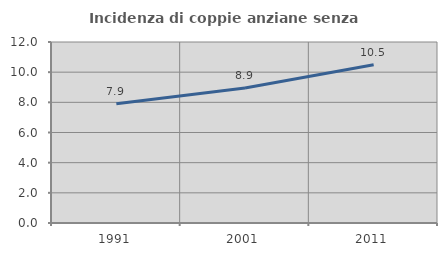
| Category | Incidenza di coppie anziane senza figli  |
|---|---|
| 1991.0 | 7.91 |
| 2001.0 | 8.947 |
| 2011.0 | 10.491 |